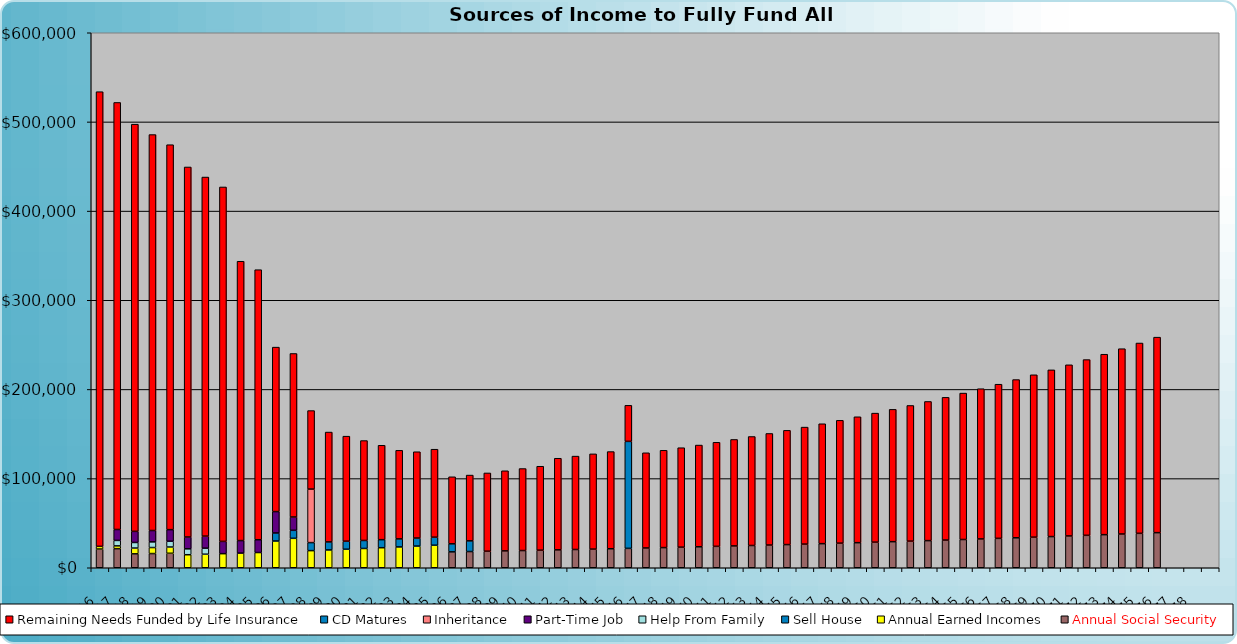
| Category | Annual Social Security | Annual Earned Incomes | Sell House | Help From Family | Part-Time Job | Inheritance | CD Matures | Remaining Needs Funded by Life Insurance |
|---|---|---|---|---|---|---|---|---|
| 2016.0 | 21000 | 3000 | 0 | 0 | 0 | 0 | 0 | 509905.178 |
| 2017.0 | 21420 | 3120 | 0 | 6120 | 12240 | 0 | 0 | 478934.666 |
| 2018.0 | 15606 | 6489.6 | 0 | 6242.4 | 12484.8 | 0 | 0 | 456636.024 |
| 2019.0 | 15918.12 | 6749.184 | 0 | 6367.248 | 12734.496 | 0 | 0 | 444033.188 |
| 2020.0 | 16236.482 | 7019.151 | 0 | 6494.593 | 12989.186 | 0 | 0 | 431714.897 |
| 2021.0 | 0 | 14599.835 | 0 | 6624.485 | 13248.97 | 0 | 0 | 414983.878 |
| 2022.0 | 0 | 15183.828 | 0 | 6756.975 | 13513.949 | 0 | 0 | 402718.011 |
| 2023.0 | 0 | 15791.181 | 0 | 0 | 13784.228 | 0 | 0 | 397478.621 |
| 2024.0 | 0 | 16422.829 | 0 | 0 | 14059.913 | 0 | 0 | 313264.566 |
| 2025.0 | 0 | 17079.742 | 0 | 0 | 14341.111 | 0 | 0 | 302870.634 |
| 2026.0 | 0 | 30000 | 9000 | 0 | 24000 | 0 | 0 | 184431.122 |
| 2027.0 | 0 | 33000 | 9000 | 0 | 14920.492 | 0 | 0 | 183393.348 |
| 2028.0 | 0 | 19212.387 | 9000 | 0 | 0 | 60000 | 0 | 88058.559 |
| 2029.0 | 0 | 19980.882 | 9000 | 0 | 0 | 0 | 0 | 123203.629 |
| 2030.0 | 0 | 20780.117 | 9000 | 0 | 0 | 0 | 0 | 117795.866 |
| 2031.0 | 0 | 21611.322 | 9000 | 0 | 0 | 0 | 0 | 112031.504 |
| 2032.0 | 0 | 22475.775 | 9000 | 0 | 0 | 0 | 0 | 105881.943 |
| 2033.0 | 0 | 23374.806 | 9000 | 0 | 0 | 0 | 0 | 99317.692 |
| 2034.0 | 0 | 24309.798 | 9000 | 0 | 0 | 0 | 0 | 96789.352 |
| 2035.0 | 0 | 25282.19 | 9000 | 0 | 0 | 0 | 0 | 98666.453 |
| 2036.0 | 17831.369 | 0 | 9000 | 0 | 0 | 0 | 0 | 75181.932 |
| 2037.0 | 18187.996 | 0 | 12000 | 0 | 0 | 0 | 0 | 73754.367 |
| 2038.0 | 18551.756 | 0 | 0 | 0 | 0 | 0 | 0 | 87769.442 |
| 2039.0 | 18922.791 | 0 | 0 | 0 | 0 | 0 | 0 | 89841.214 |
| 2040.0 | 19301.247 | 0 | 0 | 0 | 0 | 0 | 0 | 91971.38 |
| 2041.0 | 19687.272 | 0 | 0 | 0 | 0 | 0 | 0 | 94161.693 |
| 2042.0 | 20081.017 | 0 | 0 | 0 | 0 | 0 | 0 | 102738.44 |
| 2043.0 | 20482.638 | 0 | 0 | 0 | 0 | 0 | 0 | 104738.291 |
| 2044.0 | 20892.29 | 0 | 0 | 0 | 0 | 0 | 0 | 106819.68 |
| 2045.0 | 21310.136 | 0 | 0 | 0 | 0 | 0 | 0 | 108983.791 |
| 2046.0 | 21736.339 | 0 | 0 | 0 | 0 | 0 | 120000 | 40435.467 |
| 2047.0 | 22171.066 | 0 | 0 | 0 | 0 | 0 | 0 | 106758.776 |
| 2048.0 | 22614.487 | 0 | 0 | 0 | 0 | 0 | 0 | 109111.085 |
| 2049.0 | 23066.777 | 0 | 0 | 0 | 0 | 0 | 0 | 111551.166 |
| 2050.0 | 23528.112 | 0 | 0 | 0 | 0 | 0 | 0 | 114080.694 |
| 2051.0 | 23998.675 | 0 | 0 | 0 | 0 | 0 | 0 | 116701.444 |
| 2052.0 | 24478.648 | 0 | 0 | 0 | 0 | 0 | 0 | 119415.292 |
| 2053.0 | 24968.221 | 0 | 0 | 0 | 0 | 0 | 0 | 122224.217 |
| 2054.0 | 25467.586 | 0 | 0 | 0 | 0 | 0 | 0 | 125130.298 |
| 2055.0 | 25976.937 | 0 | 0 | 0 | 0 | 0 | 0 | 128135.72 |
| 2056.0 | 26496.476 | 0 | 0 | 0 | 0 | 0 | 0 | 131242.77 |
| 2057.0 | 27026.405 | 0 | 0 | 0 | 0 | 0 | 0 | 134453.842 |
| 2058.0 | 27566.934 | 0 | 0 | 0 | 0 | 0 | 0 | 137771.439 |
| 2059.0 | 28118.272 | 0 | 0 | 0 | 0 | 0 | 0 | 141198.171 |
| 2060.0 | 28680.638 | 0 | 0 | 0 | 0 | 0 | 0 | 144736.758 |
| 2061.0 | 29254.25 | 0 | 0 | 0 | 0 | 0 | 0 | 148390.035 |
| 2062.0 | 29839.335 | 0 | 0 | 0 | 0 | 0 | 0 | 152160.948 |
| 2063.0 | 30436.122 | 0 | 0 | 0 | 0 | 0 | 0 | 156052.561 |
| 2064.0 | 31044.845 | 0 | 0 | 0 | 0 | 0 | 0 | 160068.057 |
| 2065.0 | 31665.742 | 0 | 0 | 0 | 0 | 0 | 0 | 164210.74 |
| 2066.0 | 32299.056 | 0 | 0 | 0 | 0 | 0 | 0 | 168484.035 |
| 2067.0 | 32945.037 | 0 | 0 | 0 | 0 | 0 | 0 | 172891.497 |
| 2068.0 | 33603.938 | 0 | 0 | 0 | 0 | 0 | 0 | 177436.805 |
| 2069.0 | 34276.017 | 0 | 0 | 0 | 0 | 0 | 0 | 182123.774 |
| 2070.0 | 34961.537 | 0 | 0 | 0 | 0 | 0 | 0 | 186956.351 |
| 2071.0 | 35660.768 | 0 | 0 | 0 | 0 | 0 | 0 | 191938.621 |
| 2072.0 | 36373.983 | 0 | 0 | 0 | 0 | 0 | 0 | 197074.811 |
| 2073.0 | 37101.463 | 0 | 0 | 0 | 0 | 0 | 0 | 202369.292 |
| 2074.0 | 37843.492 | 0 | 0 | 0 | 0 | 0 | 0 | 207826.583 |
| 2075.0 | 38600.362 | 0 | 0 | 0 | 0 | 0 | 0 | 213451.355 |
| 2076.0 | 39372.369 | 0 | 0 | 0 | 0 | 0 | 0 | 219248.435 |
| 2077.0 | 0 | 0 | 0 | 0 | 0 | 0 | 0 | 0 |
| 2078.0 | 0 | 0 | 0 | 0 | 0 | 0 | 0 | 0 |